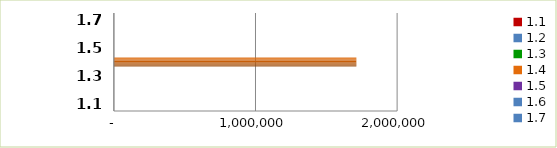
| Category | Series 0 |
|---|---|
| 1.1 | 0 |
| 1.2 | 0 |
| 1.3 | 0 |
| 1.4 | 1712162 |
| 1.5 | 0 |
| 1.6 | 0 |
| 1.7 | 0 |